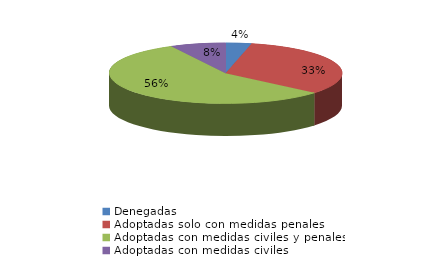
| Category | Series 0 |
|---|---|
| Denegadas | 7 |
| Adoptadas solo con medidas penales | 64 |
| Adoptadas con medidas civiles y penales | 110 |
| Adoptadas con medidas civiles | 15 |